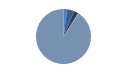
| Category | Series 0 |
|---|---|
| ARRASTRE | 9 |
| CERCO | 17 |
| PALANGRE | 11 |
| REDES DE ENMALLE | 0 |
| ARTES FIJAS | 1 |
| ARTES MENORES | 374 |